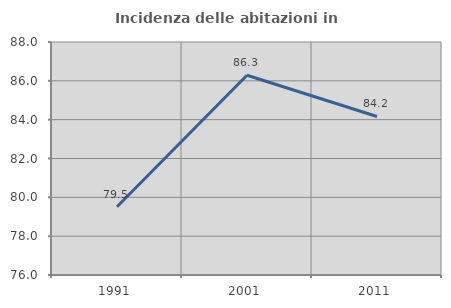
| Category | Incidenza delle abitazioni in proprietà  |
|---|---|
| 1991.0 | 79.516 |
| 2001.0 | 86.285 |
| 2011.0 | 84.164 |